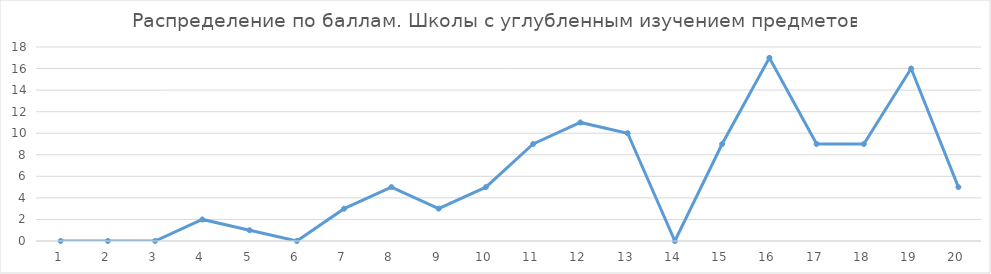
| Category | Series 0 |
|---|---|
| 0 | 0 |
| 1 | 0 |
| 2 | 0 |
| 3 | 2 |
| 4 | 1 |
| 5 | 0 |
| 6 | 3 |
| 7 | 5 |
| 8 | 3 |
| 9 | 5 |
| 10 | 9 |
| 11 | 11 |
| 12 | 10 |
| 13 | 0 |
| 14 | 9 |
| 15 | 17 |
| 16 | 9 |
| 17 | 9 |
| 18 | 16 |
| 19 | 5 |